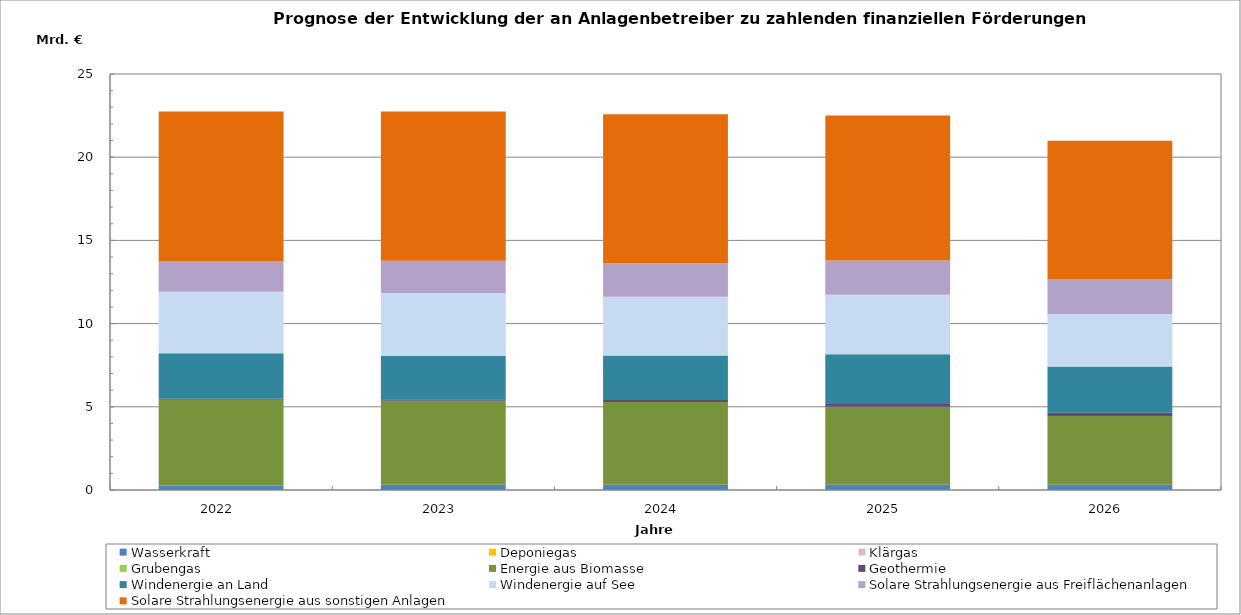
| Category | Wasserkraft | Deponiegas | Klärgas | Grubengas | Energie aus Biomasse | Geothermie | Windenergie an Land | Windenergie auf See | Solare Strahlungsenergie aus Freiflächenanlagen | Solare Strahlungsenergie aus sonstigen Anlagen |
|---|---|---|---|---|---|---|---|---|---|---|
| 2022.0 | 288.419 | 2.06 | 2.007 | 6.356 | 5126.747 | 63.805 | 2729.29 | 3690.943 | 1859.611 | 8981.09 |
| 2023.0 | 300.418 | 1.876 | 1.87 | 7.783 | 5047.7 | 92.723 | 2608.168 | 3784.347 | 1930.484 | 8975.607 |
| 2024.0 | 311.25 | 1.472 | 1.8 | 7.851 | 4961.762 | 124.379 | 2677.156 | 3531.183 | 2009.325 | 8955.305 |
| 2025.0 | 317.402 | 0.652 | 1.781 | 0.729 | 4685.753 | 159.254 | 2997.158 | 3565.1 | 2067.008 | 8709.514 |
| 2026.0 | 319.124 | 0.48 | 1.756 | 0.412 | 4132.315 | 193.326 | 2779.264 | 3144.889 | 2085.86 | 8331.956 |